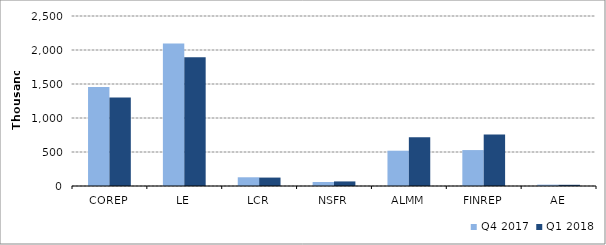
| Category | Q4 2017 | Q1 2018 |
|---|---|---|
| COREP | 1455149 | 1300415 |
| LE | 2094305 | 1895140 |
| LCR | 128150 | 123890 |
| NSFR | 58455 | 67293 |
| ALMM | 519001 | 717352 |
| FINREP | 528465 | 757435 |
| AE | 20010 | 17773 |